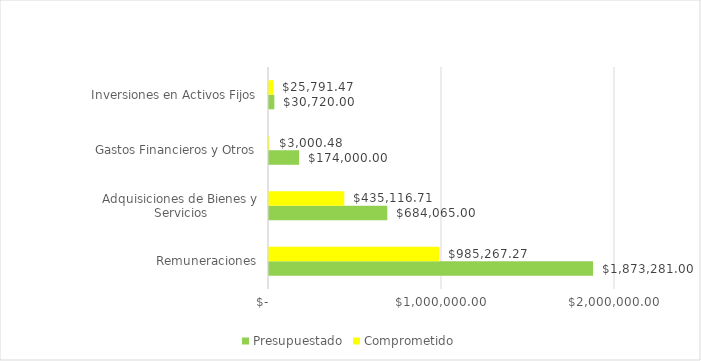
| Category | Presupuestado | Comprometido |
|---|---|---|
| Remuneraciones | 1873281 | 985267.27 |
| Adquisiciones de Bienes y Servicios | 684065 | 435116.71 |
| Gastos Financieros y Otros | 174000 | 3000.48 |
| Inversiones en Activos Fijos | 30720 | 25791.47 |